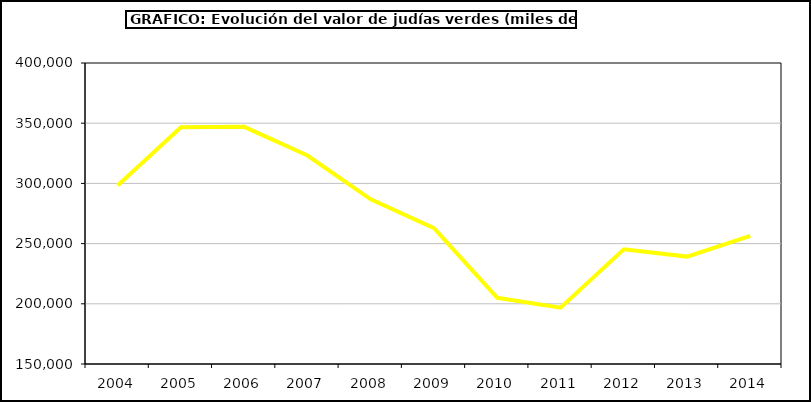
| Category | Valor |
|---|---|
| 2004.0 | 298249.44 |
| 2005.0 | 346621.552 |
| 2006.0 | 346955.242 |
| 2007.0 | 323171.098 |
| 2008.0 | 286762.816 |
| 2009.0 | 262825.282 |
| 2010.0 | 205008.431 |
| 2011.0 | 196749.281 |
| 2012.0 | 245279.866 |
| 2013.0 | 239211.036 |
| 2014.0 | 256441.694 |